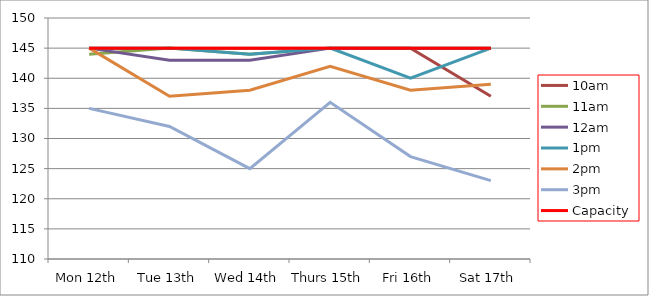
| Category | 9am | 10am | 11am | 12am | 1pm | 2pm | 3pm | 4pm | 5pm | Capacity |
|---|---|---|---|---|---|---|---|---|---|---|
| Mon 12th |  | 145 | 144 | 145 | 145 | 145 | 135 |  |  | 145 |
| Tue 13th |  | 145 | 145 | 143 | 145 | 137 | 132 |  |  | 145 |
| Wed 14th |  | 145 | 144 | 143 | 144 | 138 | 125 |  |  | 145 |
| Thurs 15th |  | 145 | 145 | 145 | 145 | 142 | 136 |  |  | 145 |
| Fri 16th |  | 145 | 145 | 145 | 140 | 138 | 127 |  |  | 145 |
| Sat 17th |  | 137 | 145 | 145 | 145 | 139 | 123 |  |  | 145 |